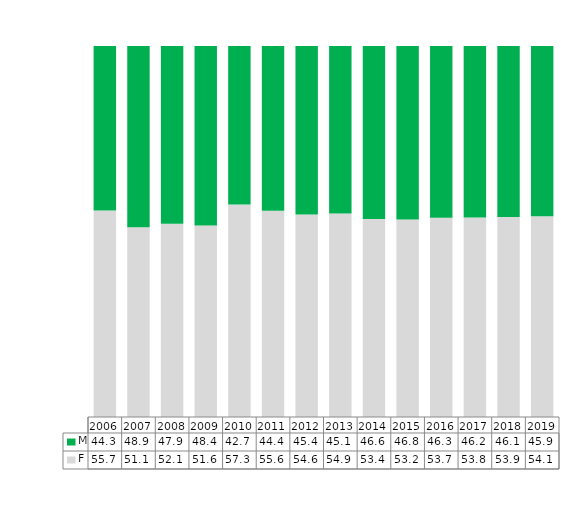
| Category | F | M |
|---|---|---|
| 2006.0 | 0.557 | 0.443 |
| 2007.0 | 0.511 | 0.489 |
| 2008.0 | 0.521 | 0.479 |
| 2009.0 | 0.516 | 0.484 |
| 2010.0 | 0.573 | 0.427 |
| 2011.0 | 0.556 | 0.444 |
| 2012.0 | 0.546 | 0.454 |
| 2013.0 | 0.549 | 0.451 |
| 2014.0 | 0.534 | 0.466 |
| 2015.0 | 0.532 | 0.468 |
| 2016.0 | 0.537 | 0.463 |
| 2017.0 | 0.538 | 0.462 |
| 2018.0 | 0.539 | 0.461 |
| 2019.0 | 0.541 | 0.459 |